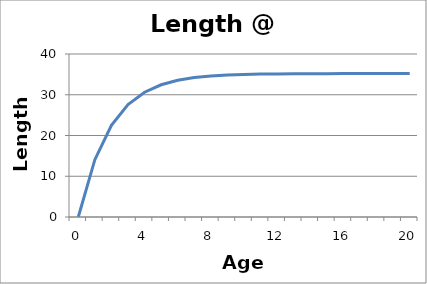
| Category | Length (mm) |
|---|---|
| 0.0 | 0 |
| 1.0 | 14.063 |
| 2.0 | 22.507 |
| 3.0 | 27.578 |
| 4.0 | 30.623 |
| 5.0 | 32.452 |
| 6.0 | 33.55 |
| 7.0 | 34.209 |
| 8.0 | 34.605 |
| 9.0 | 34.843 |
| 10.0 | 34.985 |
| 11.0 | 35.071 |
| 12.0 | 35.123 |
| 13.0 | 35.154 |
| 14.0 | 35.172 |
| 15.0 | 35.183 |
| 16.0 | 35.19 |
| 17.0 | 35.194 |
| 18.0 | 35.196 |
| 19.0 | 35.198 |
| 20.0 | 35.199 |